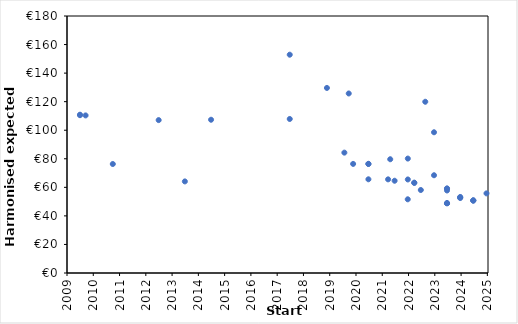
| Category | Series 0 |
|---|---|
| 43739.0 | 125.736 |
| 44805.0 | 119.937 |
| 44652.0 | 63.277 |
| 44652.0 | 63.106 |
| 44317.0 | 79.672 |
| 45108.0 | 48.882 |
| 45474.0 | 50.785 |
| 45474.0 | 50.785 |
| 45108.0 | 48.882 |
| 45474.0 | 50.785 |
| 45108.0 | 48.882 |
| 39995.0 | 110.537 |
| 39995.0 | 110.867 |
| 41091.0 | 107.089 |
| 41821.0 | 107.341 |
| 42917.0 | 107.876 |
| 42917.0 | 152.893 |
| 43435.0 | 129.617 |
| 43800.0 | 76.405 |
| 44013.0 | 76.43 |
| 44013.0 | 76.4 |
| 44287.0 | 65.592 |
| 44013.0 | 65.634 |
| 44378.0 | 64.617 |
| 44743.0 | 58.128 |
| 45108.0 | 57.798 |
| 45292.0 | 52.956 |
| 45292.0 | 53.229 |
| 44927.0 | 68.463 |
| 45658.0 | 55.772 |
| 44562.0 | 80.147 |
| 44927.0 | 98.567 |
| 44562.0 | 65.519 |
| 45292.0 | 52.514 |
| 40073.0 | 110.372 |
| 41456.0 | 64.148 |
| 43678.0 | 84.3 |
| 44561.0 | 51.619 |
| 40452.0 | 76.332 |
| 45108.0 | 59.266 |
| 45108.0 | 58.982 |